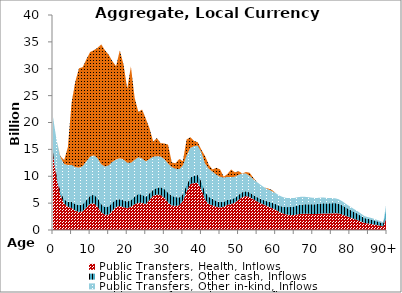
| Category | Public Transfers, Health, Inflows | Public Transfers, Other cash, Inflows | Public Transfers, Other in-kind, Inflows | Public Transfers, Education, Inflows |
|---|---|---|---|---|
| 0 | 14071.226 | 728.235 | 6235.63 | 0 |
|  | 9602.357 | 733.271 | 6253.967 | 0 |
| 2 | 6455.039 | 738.792 | 6329.315 | 200.272 |
| 3 | 4914.915 | 780.776 | 6579.432 | 704.337 |
| 4 | 4327.031 | 936.168 | 6814.775 | 3299.913 |
| 5 | 4121.938 | 1117.531 | 6876.913 | 11534.646 |
| 6 | 3599.039 | 1220.339 | 6873.872 | 15896.17 |
| 7 | 3340.019 | 1315.311 | 6945.222 | 18483.609 |
| 8 | 3482.424 | 1302.857 | 7094.701 | 18421.174 |
| 9 | 4211.957 | 1358.667 | 7220.976 | 18977.15 |
| 10 | 4882.437 | 1485.083 | 7279.725 | 19455.767 |
| 11 | 4967.957 | 1599.884 | 7317.703 | 19572.221 |
| 12 | 4339.893 | 1661.736 | 7357.507 | 20525.417 |
| 13 | 3290.008 | 1530.667 | 7413.301 | 22294.93 |
| 14 | 2855.14 | 1410.267 | 7539.228 | 21638.607 |
| 15 | 2813.818 | 1586.497 | 7626.569 | 20585.212 |
| 16 | 3602.337 | 1539.424 | 7546.528 | 18716.941 |
| 17 | 4286.517 | 1339.343 | 7492.82 | 17357.507 |
| 18 | 4486.966 | 1256.935 | 7619.964 | 20055.332 |
| 19 | 4249.759 | 1258.604 | 7599.281 | 17699.082 |
| 20 | 4044.602 | 1238.772 | 7242.355 | 13762.104 |
| 21 | 4346.179 | 1226.088 | 6923.756 | 17917.429 |
| 22 | 4784.742 | 1444.413 | 6842.412 | 11496.824 |
| 23 | 5076.789 | 1631.649 | 6825.552 | 8438.727 |
| 24 | 5056.071 | 1514.651 | 6744.729 | 9098.847 |
| 25 | 4818.316 | 1357.837 | 6578.39 | 7976.081 |
| 26 | 5613.729 | 1220.374 | 6389.976 | 5709.94 |
| 27 | 6384.617 | 1101.076 | 6147.681 | 2805.21 |
| 28 | 6591.827 | 1270.771 | 5873.404 | 3371.203 |
| 29 | 6522.195 | 1458.382 | 5672.302 | 2499.015 |
| 30 | 6000.492 | 1654.115 | 5535.946 | 2911.911 |
| 31 | 5133.462 | 1810.827 | 5443.39 | 3486.769 |
| 32 | 4561.073 | 1799.136 | 5347.446 | 875.465 |
| 33 | 4484.622 | 1650.307 | 5266.362 | 1002.001 |
| 34 | 4591.532 | 1460.602 | 5278.007 | 1868.039 |
| 35 | 5409.096 | 1265.021 | 5352.486 | 791.126 |
| 36 | 7213.576 | 1188.51 | 5435.395 | 2998.845 |
| 37 | 8543.931 | 1239.903 | 5491.884 | 1991.983 |
| 38 | 8746.855 | 1357.599 | 5497.533 | 978.866 |
| 39 | 8779.933 | 1458.271 | 5451.212 | 637.898 |
| 40 | 7559.469 | 1450.455 | 5383.164 | 501.586 |
| 41 | 5616.711 | 1410.984 | 5295.128 | 1412.127 |
| 42 | 4827.413 | 1346.349 | 5190.666 | 739.131 |
| 43 | 4573.521 | 1213.242 | 5065.868 | 405.874 |
| 44 | 4320.749 | 1075.08 | 4909.697 | 1265.064 |
| 45 | 4201.335 | 986.131 | 4710.421 | 1384.898 |
| 46 | 4330.155 | 937.744 | 4490.982 | 143.527 |
| 47 | 4695.063 | 888.154 | 4297.093 | 532.952 |
| 48 | 4858.295 | 863.775 | 4112.417 | 1423.799 |
| 49 | 5091.813 | 882.906 | 3926.002 | 819.527 |
| 50 | 5637.913 | 898.237 | 3718.817 | 692.449 |
| 51 | 6117.678 | 913.632 | 3494.946 | 0 |
| 52 | 6317.258 | 910.18 | 3288.369 | 267.124 |
| 53 | 6116.833 | 857.223 | 3074.145 | 596.491 |
| 54 | 5717.568 | 812.254 | 2920.059 | 228.703 |
| 55 | 5310.318 | 807.379 | 2788.309 | 0 |
| 56 | 4970.186 | 811.179 | 2590.51 | 0 |
| 57 | 4660.827 | 834.555 | 2414.35 | 0 |
| 58 | 4385.353 | 908.742 | 2274.257 | 142.638 |
| 59 | 4089.126 | 984.408 | 2154.934 | 215.256 |
| 60 | 3761.618 | 1066.575 | 2037.089 | 0 |
| 61 | 3362.525 | 1151.399 | 1901.602 | 0 |
| 62 | 3083.589 | 1239.924 | 1782.192 | 0 |
| 63 | 2878.616 | 1368.831 | 1701.369 | 0 |
| 64 | 2805.589 | 1498.578 | 1631.409 | 0 |
| 65 | 2797.426 | 1593.577 | 1568.402 | 0 |
| 66 | 2924.45 | 1668.337 | 1513.651 | 0 |
| 67 | 3028.28 | 1719.34 | 1444.126 | 0 |
| 68 | 3039.237 | 1763.014 | 1365.475 | 0 |
| 69 | 3011.434 | 1790.668 | 1283.262 | 0 |
| 70 | 2982.275 | 1806.484 | 1203.568 | 0 |
| 71 | 2980.831 | 1831.707 | 1143.951 | 0 |
| 72 | 3036.309 | 1878.634 | 1105.364 | 0 |
| 73 | 3072.008 | 1909.639 | 1060.173 | 0 |
| 74 | 3045.788 | 1893.785 | 997.165 | 0 |
| 75 | 3095.398 | 1897.979 | 951.453 | 0 |
| 76 | 3129.753 | 1879.643 | 902.003 | 0 |
| 77 | 3081.055 | 1798.916 | 831.869 | 0 |
| 78 | 2886.179 | 1686.684 | 755.739 | 0 |
| 79 | 2615.307 | 1538.711 | 671.353 | 0 |
| 80 | 2351.412 | 1425.069 | 607.303 | 0 |
| 81 | 2089.381 | 1309.015 | 544.904 | 0 |
| 82 | 1861.62 | 1197.381 | 486.242 | 0 |
| 83 | 1579.581 | 1047.753 | 414.805 | 0 |
| 84 | 1311.869 | 898.461 | 346.757 | 0 |
| 85 | 1205.752 | 851.663 | 320.424 | 0 |
| 86 | 1097.695 | 807.543 | 295.743 | 0 |
| 87 | 956.388 | 734.255 | 262.023 | 0 |
| 88 | 827.731 | 660.04 | 229.955 | 0 |
| 89 | 678.485 | 562.791 | 191.629 | 0 |
| 90+ | 2640.862 | 2333.958 | 776.336 | 0 |